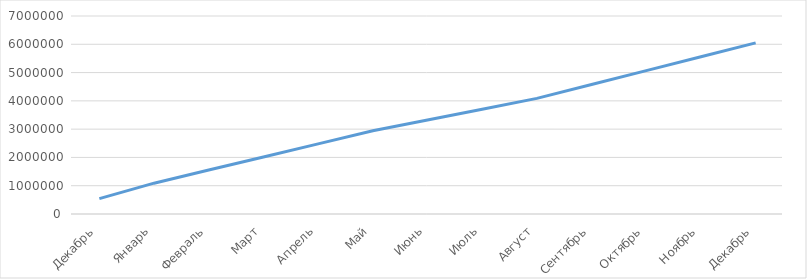
| Category | Прибыль | Кредит |
|---|---|---|
| Декабрь | 545000 |  |
| Январь | 1090000 |  |
| Февраль | 1553250 |  |
| Март | 2016500 |  |
| Апрель | 2479750 |  |
| Май | 2943000 |  |
| Июнь | 3324500 |  |
| Июль | 3706000 |  |
| Август | 4087500 |  |
| Сентябрь | 4578000 |  |
| Октябрь | 5068500 |  |
| Ноябрь | 5559000 |  |
| Декабрь | 6049500 |  |